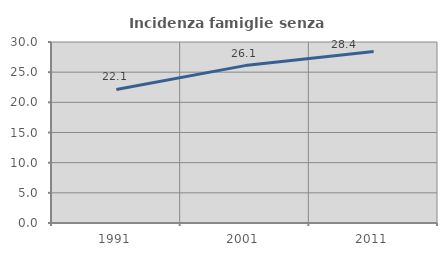
| Category | Incidenza famiglie senza nuclei |
|---|---|
| 1991.0 | 22.142 |
| 2001.0 | 26.087 |
| 2011.0 | 28.427 |